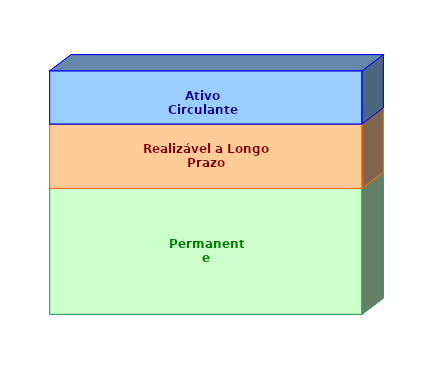
| Category | Permanente | Realizável a Longo Prazo | Ativo Circulante |
|---|---|---|---|
| 0 | 0.517 | 0.265 | 0.218 |